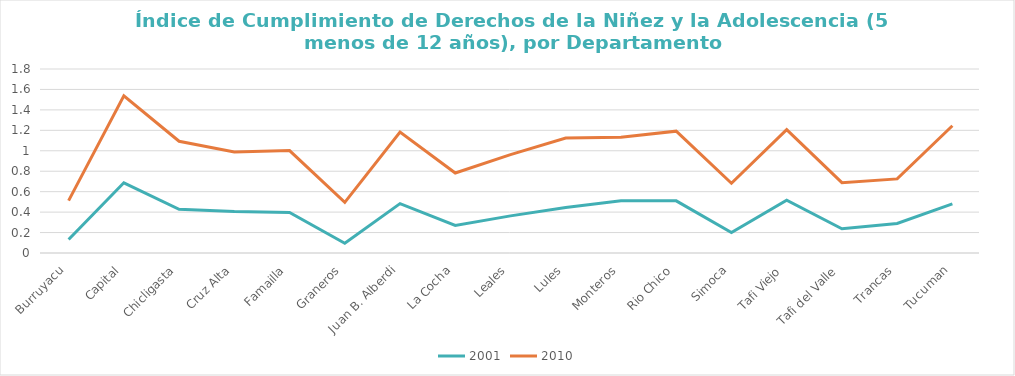
| Category | 2001 | 2010 |
|---|---|---|
| Burruyacu | 0.132 | 0.38 |
| Capital | 0.687 | 0.85 |
| Chicligasta | 0.428 | 0.665 |
| Cruz Alta | 0.406 | 0.582 |
| Famailla | 0.396 | 0.606 |
| Graneros | 0.095 | 0.4 |
| Juan B. Alberdi | 0.483 | 0.701 |
| La Cocha | 0.269 | 0.514 |
| Leales | 0.363 | 0.599 |
| Lules | 0.445 | 0.68 |
| Monteros | 0.512 | 0.62 |
| Rio Chico | 0.51 | 0.682 |
| Simoca | 0.2 | 0.482 |
| Tafi Viejo | 0.517 | 0.69 |
| Tafi del Valle | 0.237 | 0.451 |
| Trancas | 0.289 | 0.436 |
| Tucuman | 0.48 | 0.765 |